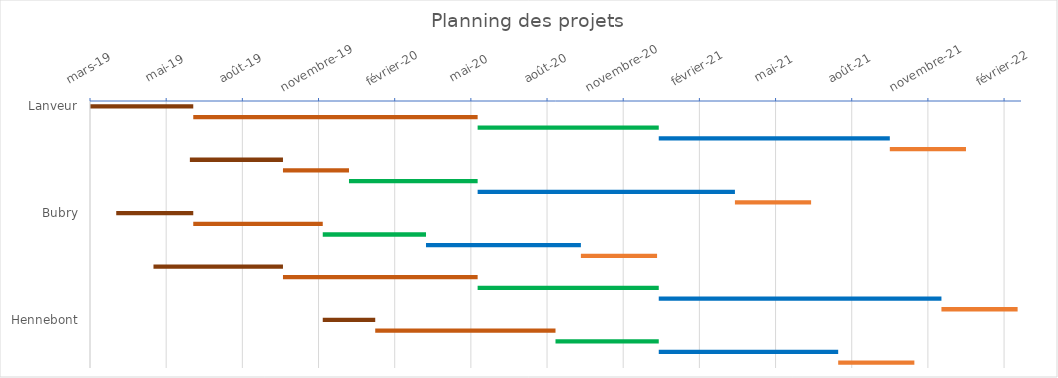
| Category | début | intervalle |
|---|---|---|
| Lanveur | 2019-03-01 | 122 |
|  | 2019-07-01 | 336 |
|  | 2020-06-01 | 214 |
|  | 2021-01-01 | 273 |
|  | 2021-10-01 | 90 |
| Plouay | 2019-06-27 | 110 |
|  | 2019-10-15 | 78 |
|  | 2020-01-01 | 152 |
|  | 2020-06-01 | 304 |
|  | 2021-04-01 | 90 |
| Bubry | 2019-04-01 | 91 |
|  | 2019-07-01 | 153 |
|  | 2019-12-01 | 122 |
|  | 2020-04-01 | 183 |
|  | 2020-10-01 | 90 |
| Ploemeur | 2019-05-15 | 153 |
|  | 2019-10-15 | 230 |
|  | 2020-06-01 | 214 |
|  | 2021-01-01 | 334 |
|  | 2021-12-01 | 90 |
| Hennebont | 2019-12-01 | 62 |